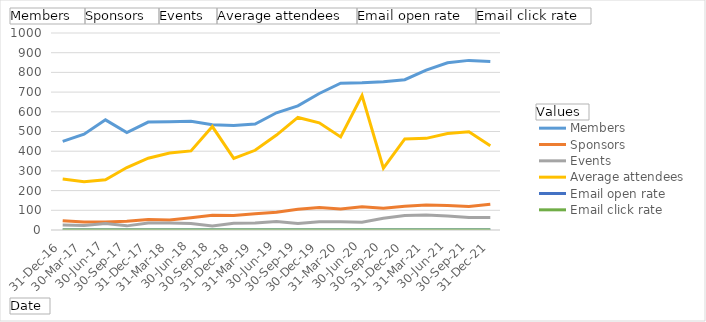
| Category | Members  | Sponsors  | Events  | Average attendees  | Email open rate  | Email click rate  |
|---|---|---|---|---|---|---|
| 31-Dec-16 | 450 | 47 | 25 | 258.817 | 0.225 | 0.022 |
| 30-Mar-17 | 486 | 40 | 23 | 244.667 | 0.233 | 0.023 |
| 30-Jun-17 | 559 | 40 | 33 | 254.867 | 0.201 | 0.014 |
| 30-Sep-17 | 495 | 44 | 21 | 317 | 0.222 | 0.02 |
| 31-Dec-17 | 548 | 53 | 36 | 364.333 | 0.22 | 0.023 |
| 31-Mar-18 | 550 | 51 | 36 | 390.667 | 0.225 | 0.027 |
| 30-Jun-18 | 552 | 62 | 33 | 401.333 | 0.216 | 0.018 |
| 30-Sep-18 | 534 | 75 | 20 | 525 | 0.208 | 0.026 |
| 31-Dec-18 | 530 | 73 | 34 | 363.233 | 0.217 | 0.024 |
| 31-Mar-19 | 538 | 82 | 35 | 404.667 | 0.214 | 0.023 |
| 30-Jun-19 | 595 | 90 | 43 | 481.81 | 0.229 | 0.034 |
| 30-Sep-19 | 630 | 105 | 33 | 571.4 | 0.22 | 0.03 |
| 30-Dec-19 | 693 | 114 | 42 | 544.083 | 0.23 | 0.029 |
| 31-Mar-20 | 745 | 107 | 42 | 472.667 | 0.146 | 0.015 |
| 30-Jun-20 | 747 | 118 | 39 | 682.117 | 0.234 | 0.04 |
| 30-Sep-20 | 753 | 110 | 60 | 313.967 | 0.202 | 0.019 |
| 31-Dec-20 | 763 | 120 | 74 | 462.149 | 0.195 | 0.017 |
| 31-Mar-21 | 812 | 127 | 76 | 465.236 | 0.221 | 0.011 |
| 30-Jun-21 | 849 | 124 | 71 | 489.294 | 0.225 | 0.01 |
| 30-Sep-21 | 861 | 119 | 63 | 498.961 | 0.215 | 0.012 |
| 31-Dec-21 | 855 | 131 | 64 | 427.655 | 0.182 | 0.01 |